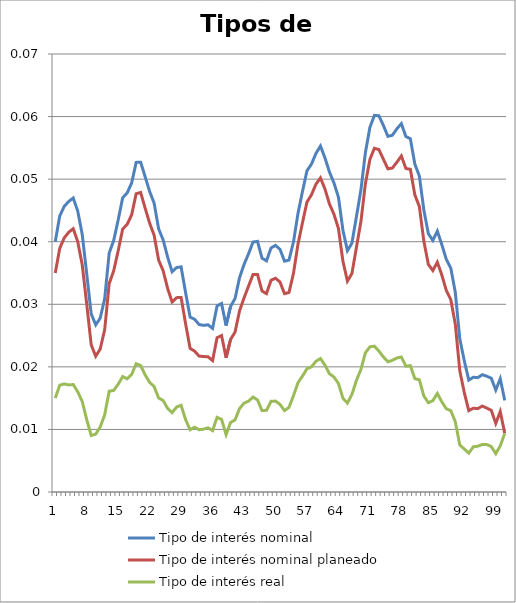
| Category | Tipo de interés nominal | Tipo de interés nominal planeado | Tipo de interés real |
|---|---|---|---|
| 0 | 0.04 | 0.035 | 0.015 |
| 1 | 0.044 | 0.039 | 0.017 |
| 2 | 0.046 | 0.041 | 0.017 |
| 3 | 0.046 | 0.042 | 0.017 |
| 4 | 0.047 | 0.042 | 0.017 |
| 5 | 0.045 | 0.04 | 0.016 |
| 6 | 0.041 | 0.036 | 0.014 |
| 7 | 0.035 | 0.03 | 0.012 |
| 8 | 0.028 | 0.024 | 0.009 |
| 9 | 0.027 | 0.022 | 0.009 |
| 10 | 0.028 | 0.023 | 0.01 |
| 11 | 0.031 | 0.026 | 0.012 |
| 12 | 0.038 | 0.033 | 0.016 |
| 13 | 0.04 | 0.035 | 0.016 |
| 14 | 0.043 | 0.039 | 0.017 |
| 15 | 0.047 | 0.042 | 0.018 |
| 16 | 0.048 | 0.043 | 0.018 |
| 17 | 0.049 | 0.044 | 0.019 |
| 18 | 0.053 | 0.048 | 0.021 |
| 19 | 0.053 | 0.048 | 0.02 |
| 20 | 0.05 | 0.045 | 0.019 |
| 21 | 0.048 | 0.043 | 0.018 |
| 22 | 0.046 | 0.041 | 0.017 |
| 23 | 0.042 | 0.037 | 0.015 |
| 24 | 0.04 | 0.035 | 0.015 |
| 25 | 0.038 | 0.033 | 0.013 |
| 26 | 0.035 | 0.03 | 0.013 |
| 27 | 0.036 | 0.031 | 0.014 |
| 28 | 0.036 | 0.031 | 0.014 |
| 29 | 0.032 | 0.027 | 0.012 |
| 30 | 0.028 | 0.023 | 0.01 |
| 31 | 0.028 | 0.023 | 0.01 |
| 32 | 0.027 | 0.022 | 0.01 |
| 33 | 0.027 | 0.022 | 0.01 |
| 34 | 0.027 | 0.022 | 0.01 |
| 35 | 0.026 | 0.021 | 0.01 |
| 36 | 0.03 | 0.025 | 0.012 |
| 37 | 0.03 | 0.025 | 0.012 |
| 38 | 0.027 | 0.021 | 0.009 |
| 39 | 0.03 | 0.024 | 0.011 |
| 40 | 0.031 | 0.026 | 0.012 |
| 41 | 0.034 | 0.029 | 0.013 |
| 42 | 0.036 | 0.031 | 0.014 |
| 43 | 0.038 | 0.033 | 0.015 |
| 44 | 0.04 | 0.035 | 0.015 |
| 45 | 0.04 | 0.035 | 0.015 |
| 46 | 0.037 | 0.032 | 0.013 |
| 47 | 0.037 | 0.032 | 0.013 |
| 48 | 0.039 | 0.034 | 0.015 |
| 49 | 0.039 | 0.034 | 0.015 |
| 50 | 0.039 | 0.034 | 0.014 |
| 51 | 0.037 | 0.032 | 0.013 |
| 52 | 0.037 | 0.032 | 0.014 |
| 53 | 0.04 | 0.035 | 0.015 |
| 54 | 0.045 | 0.04 | 0.017 |
| 55 | 0.048 | 0.043 | 0.019 |
| 56 | 0.051 | 0.046 | 0.02 |
| 57 | 0.052 | 0.047 | 0.02 |
| 58 | 0.054 | 0.049 | 0.021 |
| 59 | 0.055 | 0.05 | 0.021 |
| 60 | 0.053 | 0.048 | 0.02 |
| 61 | 0.051 | 0.046 | 0.019 |
| 62 | 0.049 | 0.044 | 0.018 |
| 63 | 0.047 | 0.042 | 0.017 |
| 64 | 0.042 | 0.037 | 0.015 |
| 65 | 0.039 | 0.034 | 0.014 |
| 66 | 0.04 | 0.035 | 0.016 |
| 67 | 0.044 | 0.039 | 0.018 |
| 68 | 0.048 | 0.043 | 0.02 |
| 69 | 0.054 | 0.049 | 0.022 |
| 70 | 0.058 | 0.053 | 0.023 |
| 71 | 0.06 | 0.055 | 0.023 |
| 72 | 0.06 | 0.055 | 0.023 |
| 73 | 0.059 | 0.053 | 0.022 |
| 74 | 0.057 | 0.052 | 0.021 |
| 75 | 0.057 | 0.052 | 0.021 |
| 76 | 0.058 | 0.053 | 0.021 |
| 77 | 0.059 | 0.054 | 0.022 |
| 78 | 0.057 | 0.052 | 0.02 |
| 79 | 0.056 | 0.052 | 0.02 |
| 80 | 0.052 | 0.047 | 0.018 |
| 81 | 0.05 | 0.046 | 0.018 |
| 82 | 0.045 | 0.04 | 0.015 |
| 83 | 0.041 | 0.036 | 0.014 |
| 84 | 0.04 | 0.035 | 0.015 |
| 85 | 0.042 | 0.037 | 0.016 |
| 86 | 0.04 | 0.035 | 0.014 |
| 87 | 0.037 | 0.032 | 0.013 |
| 88 | 0.036 | 0.031 | 0.013 |
| 89 | 0.032 | 0.027 | 0.011 |
| 90 | 0.024 | 0.019 | 0.008 |
| 91 | 0.021 | 0.016 | 0.007 |
| 92 | 0.018 | 0.013 | 0.006 |
| 93 | 0.018 | 0.013 | 0.007 |
| 94 | 0.018 | 0.013 | 0.007 |
| 95 | 0.019 | 0.014 | 0.008 |
| 96 | 0.019 | 0.013 | 0.008 |
| 97 | 0.018 | 0.013 | 0.007 |
| 98 | 0.016 | 0.011 | 0.006 |
| 99 | 0.018 | 0.013 | 0.007 |
| 100 | 0.015 | 0.009 | 0.009 |